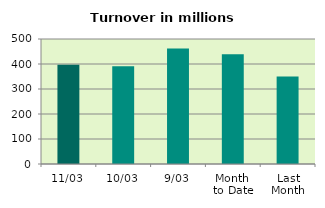
| Category | Series 0 |
|---|---|
| 11/03 | 396.884 |
| 10/03 | 390.817 |
| 9/03 | 461.818 |
| Month 
to Date | 438.573 |
| Last
Month | 349.641 |